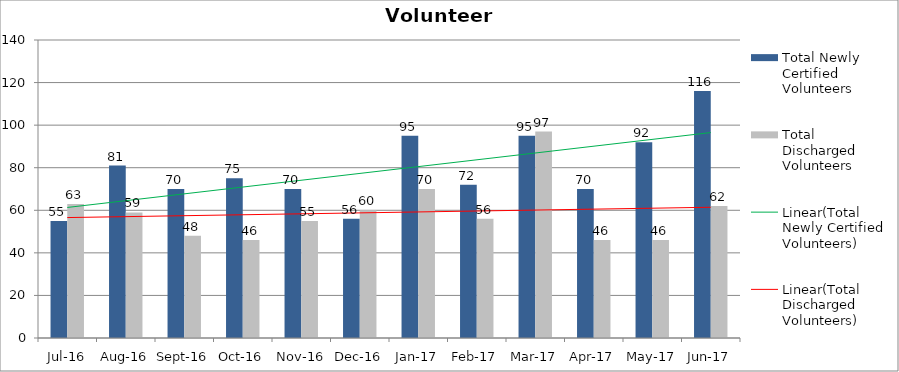
| Category | Total Newly Certified Volunteers | Total Discharged Volunteers |
|---|---|---|
| Jul-16 | 55 | 63 |
| Aug-16 | 81 | 59 |
| Sep-16 | 70 | 48 |
| Oct-16 | 75 | 46 |
| Nov-16 | 70 | 55 |
| Dec-16 | 56 | 60 |
| Jan-17 | 95 | 70 |
| Feb-17 | 72 | 56 |
| Mar-17 | 95 | 97 |
| Apr-17 | 70 | 46 |
| May-17 | 92 | 46 |
| Jun-17 | 116 | 62 |